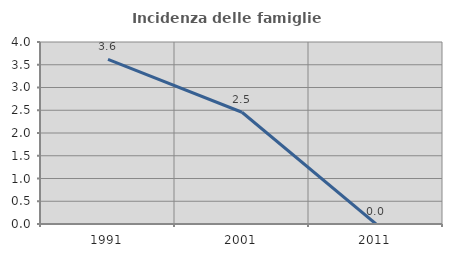
| Category | Incidenza delle famiglie numerose |
|---|---|
| 1991.0 | 3.62 |
| 2001.0 | 2.456 |
| 2011.0 | 0 |